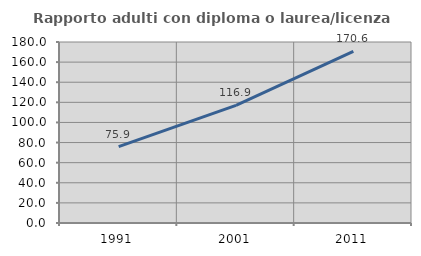
| Category | Rapporto adulti con diploma o laurea/licenza media  |
|---|---|
| 1991.0 | 75.87 |
| 2001.0 | 116.914 |
| 2011.0 | 170.642 |